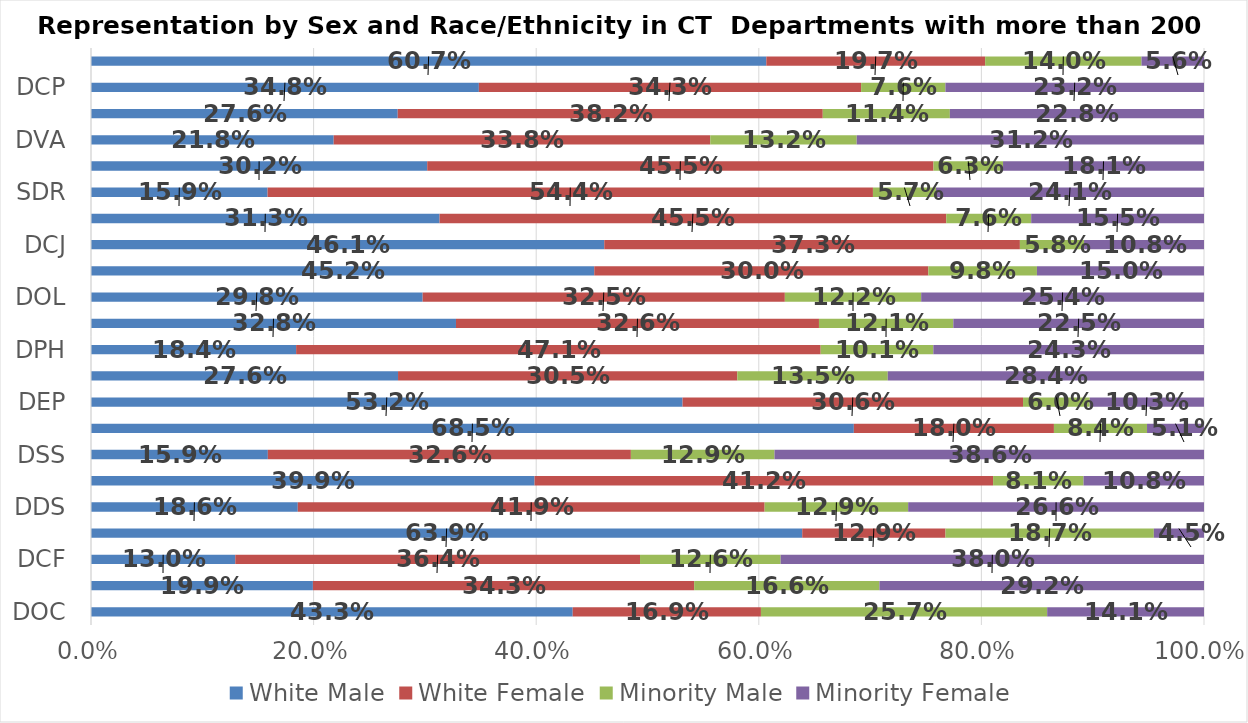
| Category | White Male | White Female | Minority Male | Minority Female |
|---|---|---|---|---|
| DOC | 0.433 | 0.169 | 0.257 | 0.141 |
| MHA | 0.199 | 0.343 | 0.166 | 0.292 |
| DCF | 0.13 | 0.364 | 0.126 | 0.38 |
| DOT | 0.639 | 0.129 | 0.187 | 0.045 |
| DDS | 0.186 | 0.419 | 0.129 | 0.266 |
| SDE | 0.399 | 0.412 | 0.081 | 0.108 |
| DSS | 0.159 | 0.326 | 0.129 | 0.386 |
| DPS | 0.685 | 0.18 | 0.084 | 0.051 |
| DEP | 0.532 | 0.306 | 0.06 | 0.103 |
| DMV | 0.276 | 0.305 | 0.135 | 0.284 |
| DPH | 0.184 | 0.471 | 0.101 | 0.243 |
| DRS | 0.328 | 0.326 | 0.121 | 0.225 |
| DOL | 0.298 | 0.325 | 0.122 | 0.254 |
| DAS | 0.452 | 0.3 | 0.098 | 0.15 |
| DCJ | 0.461 | 0.373 | 0.058 | 0.108 |
| PDS | 0.313 | 0.455 | 0.076 | 0.155 |
| SDR | 0.159 | 0.544 | 0.057 | 0.241 |
| OAG | 0.302 | 0.455 | 0.062 | 0.181 |
| DVA | 0.218 | 0.338 | 0.132 | 0.312 |
| OSC | 0.276 | 0.382 | 0.114 | 0.228 |
| DCP | 0.348 | 0.343 | 0.076 | 0.232 |
| MIL | 0.607 | 0.197 | 0.14 | 0.056 |